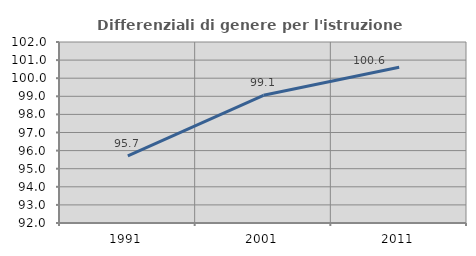
| Category | Differenziali di genere per l'istruzione superiore |
|---|---|
| 1991.0 | 95.714 |
| 2001.0 | 99.054 |
| 2011.0 | 100.602 |